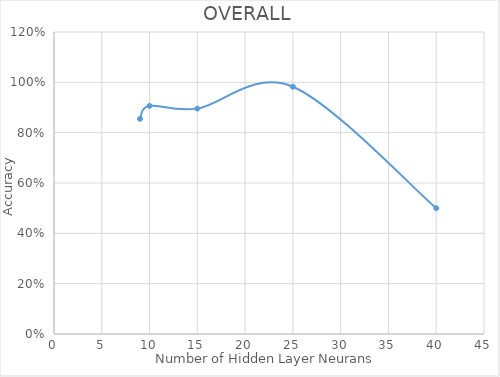
| Category | OVERALL |
|---|---|
| 9.0 | 0.855 |
| 10.0 | 0.906 |
| 15.0 | 0.896 |
| 25.0 | 0.982 |
| 40.0 | 0.5 |